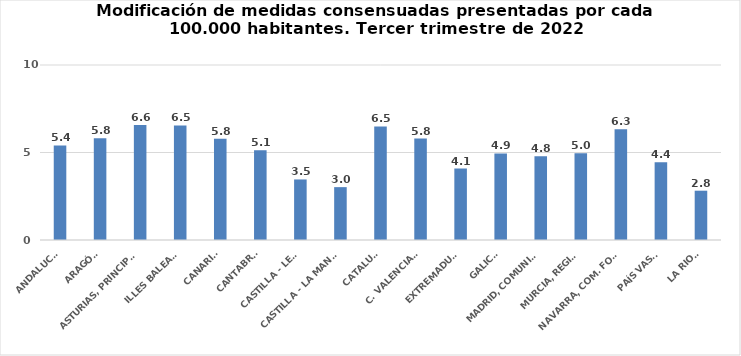
| Category | Series 0 |
|---|---|
| ANDALUCÍA | 5.403 |
| ARAGÓN | 5.81 |
| ASTURIAS, PRINCIPADO | 6.57 |
| ILLES BALEARS | 6.546 |
| CANARIAS | 5.789 |
| CANTABRIA | 5.126 |
| CASTILLA - LEÓN | 3.46 |
| CASTILLA - LA MANCHA | 3.021 |
| CATALUÑA | 6.488 |
| C. VALENCIANA | 5.795 |
| EXTREMADURA | 4.079 |
| GALICIA | 4.946 |
| MADRID, COMUNIDAD | 4.789 |
| MURCIA, REGIÓN | 4.963 |
| NAVARRA, COM. FORAL | 6.329 |
| PAÍS VASCO | 4.44 |
| LA RIOJA | 2.817 |